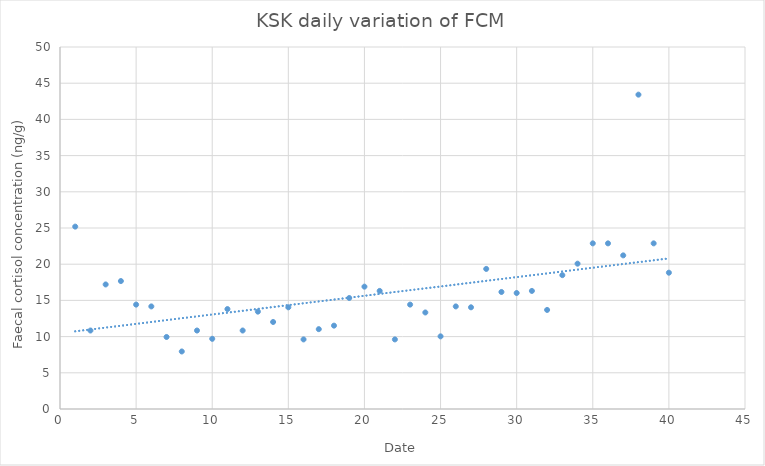
| Category | Cortisol |
|---|---|
| 0 | 25.19 |
| 1 | 10.84 |
| 2 | 17.203 |
| 3 | 17.672 |
| 4 | 14.418 |
| 5 | 14.169 |
| 6 | 9.948 |
| 7 | 7.946 |
| 8 | 10.84 |
| 9 | 9.694 |
| 10 | 13.803 |
| 11 | 10.84 |
| 12 | 13.448 |
| 13 | 12.019 |
| 14 | 14.046 |
| 15 | 9.611 |
| 16 | 11.028 |
| 17 | 11.513 |
| 18 | 15.33 |
| 19 | 16.899 |
| 20 | 16.308 |
| 21 | 9.611 |
| 22 | 14.418 |
| 23 | 13.332 |
| 24 | 10.034 |
| 25 | 14.169 |
| 26 | 14.046 |
| 27 | 19.349 |
| 28 | 16.164 |
| 29 | 16.022 |
| 30 | 16.308 |
| 31 | 13.684 |
| 32 | 18.488 |
| 33 | 20.072 |
| 34 | 22.879 |
| 35 | 22.879 |
| 36 | 21.22 |
| 37 | 43.419 |
| 38 | 22.879 |
| 39 | 18.827 |